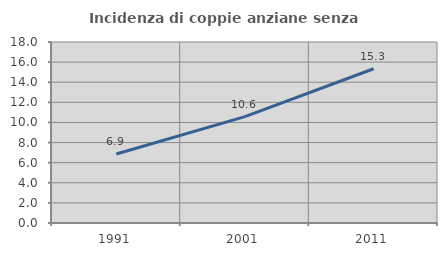
| Category | Incidenza di coppie anziane senza figli  |
|---|---|
| 1991.0 | 6.866 |
| 2001.0 | 10.574 |
| 2011.0 | 15.337 |